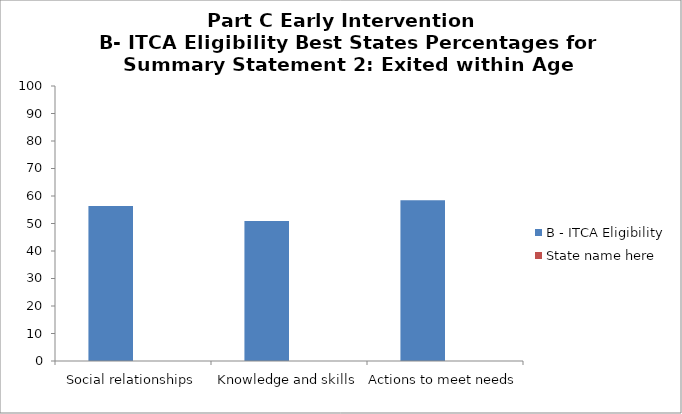
| Category | B - ITCA Eligibility | State name here |
|---|---|---|
| Social relationships | 56.4 |  |
| Knowledge and skills | 50.9 |  |
| Actions to meet needs | 58.5 |  |